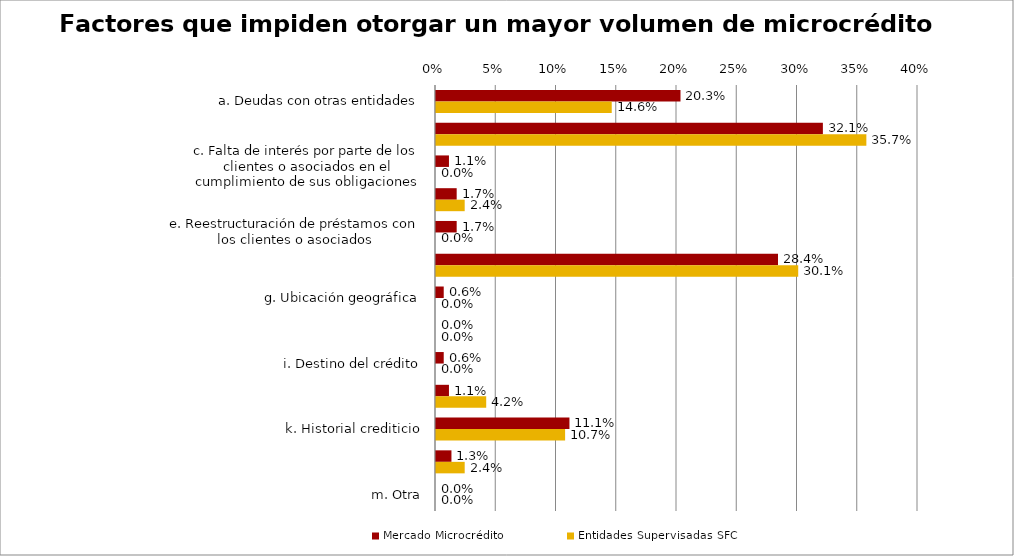
| Category | Mercado Microcrédito | Entidades Supervisadas SFC |
|---|---|---|
| a. Deudas con otras entidades | 0.203 | 0.146 |
| b. Capacidad de pago de los clientes | 0.321 | 0.357 |
| c. Falta de interés por parte de los clientes o asociados en el cumplimiento de sus obligaciones | 0.011 | 0 |
| d. Actividad económica del cliente o asocidado | 0.017 | 0.024 |
| e. Reestructuración de préstamos con los clientes o asociados | 0.017 | 0 |
| f. El nivel de deuda del cliente, con su entidad o con otras instituciones, es superior a su capacidad de pago (sobrendeudamiento) | 0.284 | 0.301 |
| g. Ubicación geográfica | 0.006 | 0 |
| h. Poca experiencia en su actividad económica | 0 | 0 |
| i. Destino del crédito | 0.006 | 0 |
| j. Falta de información financiera de los nuevos clientes o asociados | 0.011 | 0.042 |
| k. Historial crediticio | 0.111 | 0.107 |
| l. Medidas adoptadas por los entes reguladores | 0.013 | 0.024 |
| m. Otra | 0 | 0 |